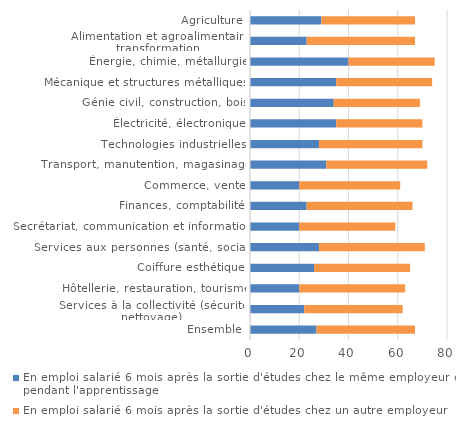
| Category | En emploi salarié 6 mois après la sortie d'études chez le même employeur que pendant l'apprentissage | En emploi salarié 6 mois après la sortie d'études chez un autre employeur |
|---|---|---|
| Ensemble | 27 | 40 |
| Services à la collectivité (sécurité, nettoyage) | 22 | 40 |
| Hôtellerie, restauration, tourisme | 20 | 43 |
| Coiffure esthétique | 26 | 39 |
| Services aux personnes (santé, social) | 28 | 43 |
| Secrétariat, communication et information | 20 | 39 |
| Finances, comptabilité | 23 | 43 |
| Commerce, vente | 20 | 41 |
| Transport, manutention, magasinage | 31 | 41 |
| Technologies industrielles | 28 | 42 |
| Électricité, électronique | 35 | 35 |
| Génie civil, construction, bois | 34 | 35 |
| Mécanique et structures métalliques | 35 | 39 |
| Énergie, chimie, métallurgie | 40 | 35 |
| Alimentation et agroalimentaire transformation | 23 | 44 |
| Agriculture | 29 | 38 |